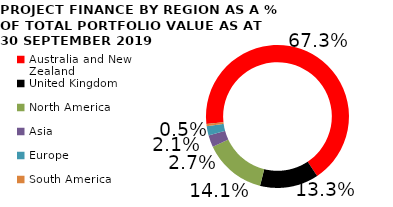
| Category | Project finance by region |
|---|---|
| Australia and New Zealand | 0.673 |
| United Kingdom | 0.133 |
| North America | 0.141 |
| Asia | 0.027 |
| Europe | 0.021 |
| South America  | 0.005 |